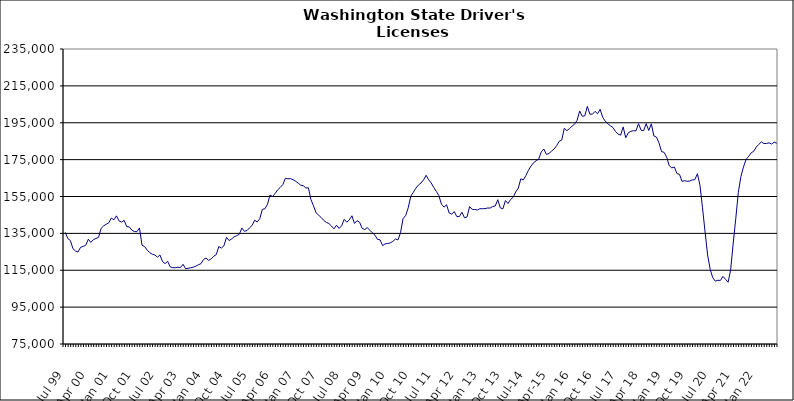
| Category | Series 0 |
|---|---|
| Jul 99 | 135560 |
| Aug 99 | 132182 |
| Sep 99 | 131104 |
| Oct 99 | 126694 |
| Nov 99 | 125425 |
| Dec 99 | 124927 |
| Jan 00 | 127499 |
| Feb 00 | 127927 |
| Mar 00 | 128547 |
| Apr 00 | 131834 |
| May 00 | 130120 |
| Jun 00 | 131595 |
| Jul 00 | 132236 |
| Aug 00 | 132819 |
| Sep 00 | 137711 |
| Oct 00 | 139063 |
| Nov 00 | 139952 |
| Dec 00 | 140732 |
| Jan 01 | 143338 |
| Feb 01 | 142359 |
| Mar 01 | 144523 |
| Apr 01 | 141758 |
| May 01 | 141135 |
| Jun 01 | 142064 |
| Jul 01 | 138646 |
| Aug 01 | 138530 |
| Sep 01 | 136784 |
| Oct 01 | 135996 |
| Nov 01 | 135917 |
| Dec 01 | 137940 |
| Jan 02 | 128531 |
| Feb 02 | 127848 |
| Mar 02 | 125876 |
| Apr 02 | 124595 |
| May 02 | 123660 |
| Jun 02 | 123282 |
| Jul 02 | 122089 |
| Aug 02 | 123279 |
| Sep 02 | 119727 |
| Oct 02 | 118588 |
| Nov 02 | 119854 |
| Dec 02 | 116851 |
| Jan 03 | 116407 |
| Feb 03 | 116382 |
| Mar 03 | 116648 |
| Apr 03 | 116471 |
| May 03 | 118231 |
| Jun 03 | 115831 |
| Jul 03 | 116082 |
| Aug 03 | 116341 |
| Sep 03 | 116653 |
| Oct 03 | 117212 |
| Nov 03 | 117962 |
| Dec 03 | 118542 |
| Jan 04 | 120817 |
| Feb 04 | 121617 |
| Mar 04 | 120369 |
| Apr 04 | 121200 |
| May 04 | 122609 |
| Jun 04 | 123484 |
| Jul 04 | 127844 |
| Aug 04 | 127025 |
| Sep 04 | 128273 |
| Oct 04 | 132853 |
| Nov 04 | 131106 |
| Dec 04 | 131935 |
| Jan 05 | 133205 |
| Feb 05 | 133736 |
| Mar 05 | 134528 |
| Apr 05 | 137889 |
| May 05 | 136130 |
| Jun 05 | 136523 |
| Jul 05 | 137997 |
| Aug 05 | 139294 |
| Sep 05 | 142140 |
| Oct 05 | 141192 |
| Nov 05 | 142937 |
| Dec 05 | 148013 |
| Jan 06 | 148341 |
| Feb 06 | 150744 |
| Mar 06 | 155794 |
| Apr 06 | 154984 |
| May 06 | 156651 |
| Jun 06 | 158638 |
| Jul 06 | 159911 |
| Aug 06 | 161445 |
| Sep 06 | 164852 |
| Oct 06 | 164570 |
| Nov 06 | 164679 |
| Dec 06 | 164127 |
| Jan 07 | 163271 |
| Feb 07 | 162273 |
| Mar 07 | 161140 |
| Apr 07 | 160860 |
| May 07 | 159633 |
| Jun 07 | 159724 |
| Jul 07 | 153303 |
| Aug 07 | 149939 |
| Sep 07 | 146172 |
| Oct 07 | 144876 |
| Nov 07 | 143613 |
| Dec 07 | 142022 |
| Jan 08 | 140909 |
| Feb 08 | 140368 |
| Mar 08 | 138998 |
| Apr 08 | 137471 |
| May 08 | 139453 |
| Jun 08 | 137680 |
| Jul 08 | 139120 |
| Aug 08 | 142612 |
| Sep-08 | 141071 |
| Oct 08 | 142313 |
| Nov 08 | 144556 |
| Dec 08 | 140394 |
| Jan 09 | 141903 |
| Feb 09 | 141036 |
| Mar 09 | 137751 |
| Apr 09 | 137060 |
| May 09 | 138101 |
| Jun 09 | 136739 |
| Jul 09 | 135317 |
| Aug 09 | 134020 |
| Sep 09 | 131756 |
| Oct 09 | 131488 |
| Nov 09 | 128370 |
| Dec 09 | 129323 |
| Jan 10 | 129531 |
| Feb 10 | 129848 |
| Mar 10 | 130654 |
| Apr 10 | 131929 |
| May 10 | 131429 |
| Jun 10 | 135357 |
| Jul 10 | 143032 |
| Aug 10 | 144686 |
| Sep 10 | 148856 |
| Oct 10 | 155042 |
| Nov 10 | 157328 |
| Dec 10 | 159501 |
| Jan 11 | 161221 |
| Feb 11 | 162312 |
| Mar 11 | 163996 |
| Apr 11 | 166495 |
| May 11 | 164040 |
| Jun 11 | 162324 |
| Jul 11 | 159862 |
| Aug 11 | 157738 |
| Sep 11 | 155430 |
| Oct 11 | 150762 |
| Nov 11 | 149255 |
| Dec 11 | 150533 |
| Jan 12 | 146068 |
| Feb 12 | 145446 |
| Mar 12 | 146788 |
| Apr 12 | 144110 |
| May 12 | 144162 |
| Jun 12 | 146482 |
| Jul 12 | 143445 |
| Aug 12 | 143950 |
| Sep 12 | 149520 |
| Oct 12 | 148033 |
| Nov 12 | 147926 |
| Dec 12 | 147674 |
| Jan 13 | 148360 |
| Feb-13 | 148388 |
| Mar-13 | 148414 |
| Apr 13 | 148749 |
| May 13 | 148735 |
| Jun-13 | 149521 |
| Jul 13 | 149837 |
| Aug 13 | 153252 |
| Sep 13 | 148803 |
| Oct 13 | 148315 |
| Nov 13 | 152804 |
| Dec 13 | 151209 |
| Jan 14 | 153357 |
| Feb-14 | 154608 |
| Mar 14 | 157479 |
| Apr 14 | 159441 |
| May 14 | 164591 |
| Jun 14 | 163995 |
| Jul-14 | 166411 |
| Aug-14 | 169272 |
| Sep 14 | 171565 |
| Oct 14 | 173335 |
| Nov 14 | 174406 |
| Dec 14 | 175302 |
| Jan 15 | 179204 |
| Feb 15 | 180737 |
| Mar 15 | 177810 |
| Apr-15 | 178331 |
| May 15 | 179601 |
| Jun-15 | 180729 |
| Jul 15 | 182540 |
| Aug 15 | 184924 |
| Sep 15 | 185620 |
| Oct 15 | 192002 |
| Nov 15 | 190681 |
| Dec 15 | 191795 |
| Jan 16 | 193132 |
| Feb 16 | 194206 |
| Mar 16 | 196319 |
| Apr 16 | 201373 |
| May 16 | 198500 |
| Jun 16 | 198743 |
| Jul 16 | 203841 |
| Aug 16 | 199630 |
| Sep 16 | 199655 |
| Oct 16 | 201181 |
| Nov 16 | 199888 |
| Dec 16 | 202304 |
| Jan 17 | 197977 |
| Feb 17 | 195889 |
| Mar 17 | 194438 |
| Apr 17 | 193335 |
| May 17 | 192430 |
| Jun 17 | 190298 |
| Jul 17 | 188832 |
| Aug 17 | 188264 |
| Sep 17 | 192738 |
| Oct 17 | 186856 |
| Nov 17 | 189537 |
| Dec 17 | 190341 |
| Jan 18 | 190670 |
| Feb 18 | 190645 |
| Mar 18 | 194476 |
| Apr 18 | 190971 |
| May 18 | 190707 |
| Jun 18 | 194516 |
| Jul 18 | 190783 |
| Aug 18 | 194390 |
| Sep 18 | 187831 |
| Oct 18 | 187188 |
| Nov 18 | 184054 |
| Dec 18 | 179347 |
| Jan 19 | 178958 |
| Feb 19 | 176289 |
| Mar 19 | 171747 |
| Apr 19 | 170532 |
| May 19 | 170967 |
| Jun 19 | 167444 |
| Jul 19 | 167059 |
| Aug 19 | 163194 |
| Sep 19 | 163599 |
| Oct 19 | 163212 |
| Nov 19 | 163388 |
| Dec 19 | 164024 |
| Jan 20 | 164114 |
| Feb 20 | 167320 |
| Mar 20 | 161221 |
| Apr 20 | 148866 |
| May 20 | 135821 |
| Jun 20 | 123252 |
| Jul 20 | 115526 |
| Aug 20 | 110940 |
| Sep 20 | 109099 |
| Oct 20 | 109566 |
| Nov 20 | 109488 |
| Dec 20 | 111658 |
| Jan 21 | 110070 |
| Feb 21 | 108491 |
| Mar 21 | 115176 |
| Apr 21 | 129726 |
| May 21 | 143052 |
| Jun 21 | 157253 |
| Jul 21 | 165832 |
| Aug 21 | 170937 |
| Sep 21 | 175042 |
| Oct 21 | 176696 |
| Nov 21 | 178677 |
| Dec 21 | 179501 |
| Jan 22 | 181825 |
| Feb 22 | 183258 |
| Mar 22 | 184618 |
| Apr 22 | 183710 |
| May 22 | 183784 |
| Jun 22 | 184101 |
| Jul 22 | 183443 |
| Aug 22 | 184475 |
| Sep 22 | 183902 |